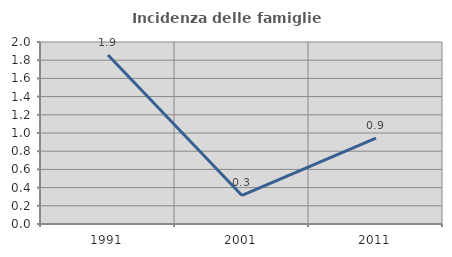
| Category | Incidenza delle famiglie numerose |
|---|---|
| 1991.0 | 1.858 |
| 2001.0 | 0.313 |
| 2011.0 | 0.943 |